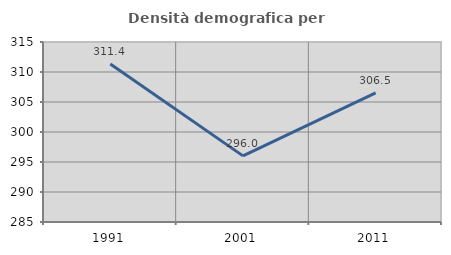
| Category | Densità demografica |
|---|---|
| 1991.0 | 311.35 |
| 2001.0 | 296.023 |
| 2011.0 | 306.537 |